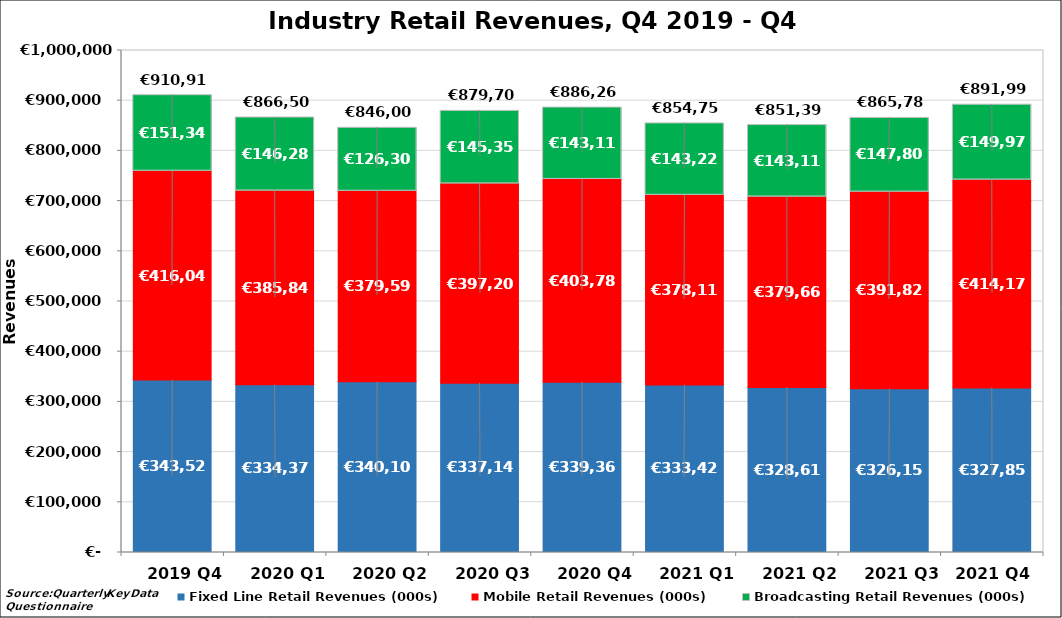
| Category | Fixed Line Retail Revenues (000s) | Mobile Retail Revenues (000s) | Broadcasting Retail Revenues (000s) |
|---|---|---|---|
| 2019 Q4 | 343527.507 | 416043.983 | 151346.492 |
| 2020 Q1 | 334374.197 | 385846.21 | 146283 |
| 2020 Q2 | 340102.583 | 379589.988 | 126307 |
| 2020 Q3 | 337144.428 | 397204.111 | 145352.467 |
| 2020 Q4 | 339365.223 | 403781.98 | 143115.932 |
| 2021 Q1 | 333422.185 | 378110.221 | 143225.728 |
| 2021 Q2 | 328618.946 | 379662.399 | 143113.892 |
| 2021 Q3 | 326158.957 | 391825.529 | 147800.809 |
| 2021 Q4  | 327850.478 | 414173.414 | 149974 |